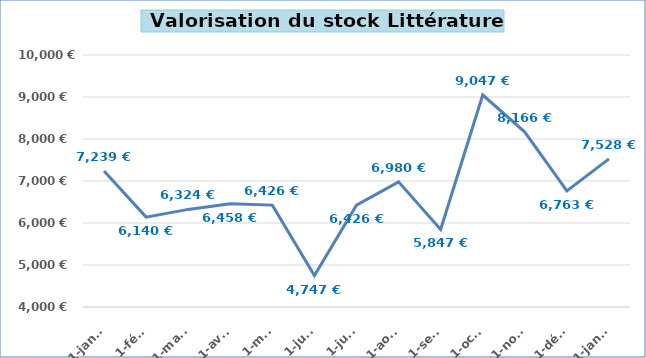
| Category | 1-janv. |
|---|---|
| 2021-01-01 | 7238.7 |
| 2021-02-01 | 6140.01 |
| 2021-03-01 | 6324.01 |
| 2021-04-01 | 6458.49 |
| 2021-05-01 | 6425.89 |
| 2021-06-01 | 4747.49 |
| 2021-07-01 | 6425.7 |
| 2021-08-01 | 6980.1 |
| 2021-09-01 | 5847.1 |
| 2021-10-01 | 9047.43 |
| 2021-11-01 | 8166.33 |
| 2021-12-01 | 6762.84 |
| 2022-01-01 | 7528 |